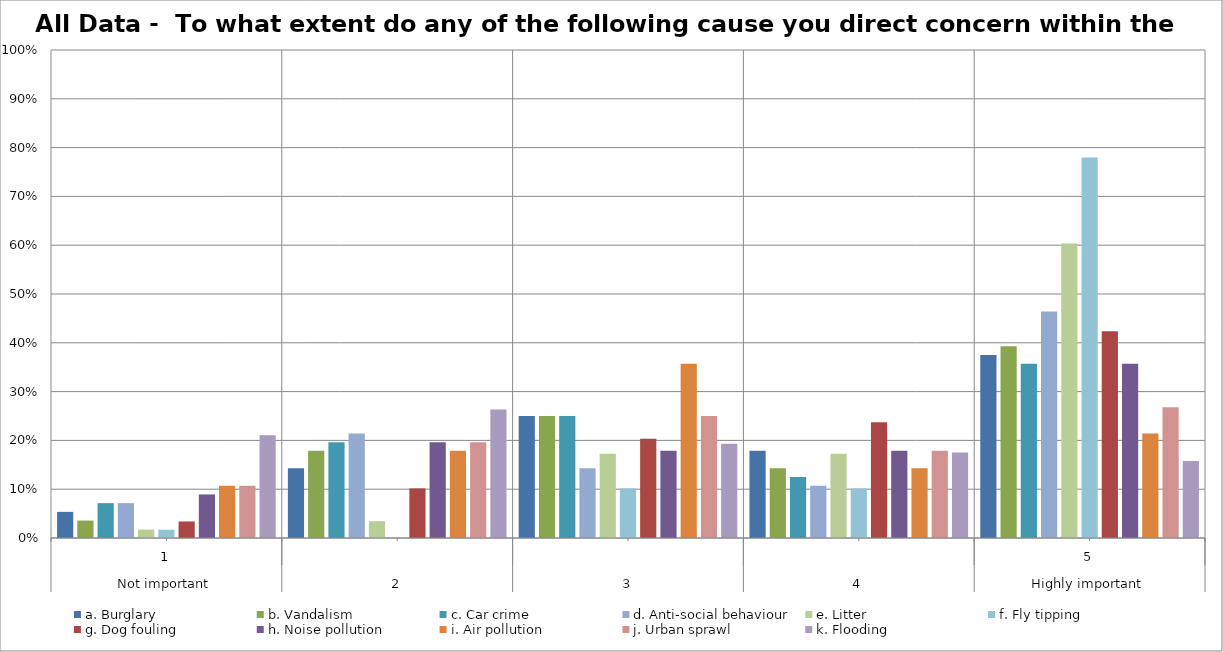
| Category | a. Burglary | b. Vandalism | c. Car crime | d. Anti-social behaviour | e. Litter | f. Fly tipping | g. Dog fouling | h. Noise pollution | i. Air pollution | j. Urban sprawl | k. Flooding |
|---|---|---|---|---|---|---|---|---|---|---|---|
| 0 | 0.054 | 0.036 | 0.071 | 0.071 | 0.017 | 0.017 | 0.034 | 0.089 | 0.107 | 0.107 | 0.211 |
| 1 | 0.143 | 0.179 | 0.196 | 0.214 | 0.034 | 0 | 0.102 | 0.196 | 0.179 | 0.196 | 0.263 |
| 2 | 0.25 | 0.25 | 0.25 | 0.143 | 0.172 | 0.102 | 0.203 | 0.179 | 0.357 | 0.25 | 0.193 |
| 3 | 0.179 | 0.143 | 0.125 | 0.107 | 0.172 | 0.102 | 0.237 | 0.179 | 0.143 | 0.179 | 0.175 |
| 4 | 0.375 | 0.393 | 0.357 | 0.464 | 0.603 | 0.78 | 0.424 | 0.357 | 0.214 | 0.268 | 0.158 |